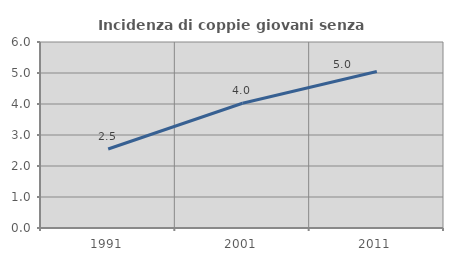
| Category | Incidenza di coppie giovani senza figli |
|---|---|
| 1991.0 | 2.548 |
| 2001.0 | 4.024 |
| 2011.0 | 5.049 |